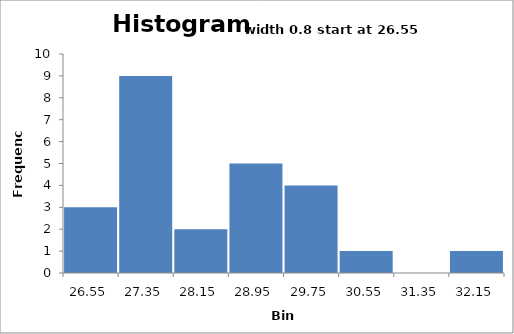
| Category | Series 0 |
|---|---|
| 26.55 | 3 |
| 27.35 | 9 |
| 28.15 | 2 |
| 28.95 | 5 |
| 29.75 | 4 |
| 30.55 | 1 |
| 31.35 | 0 |
| 32.15 | 1 |